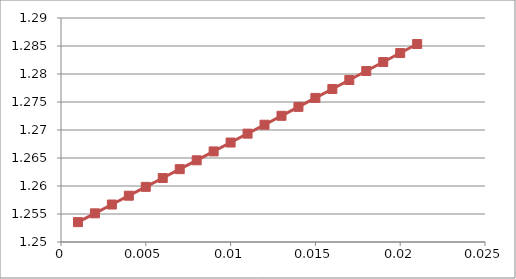
| Category | Series 1 |
|---|---|
| 0.001 | 1.254 |
| 0.002 | 1.255 |
| 0.003 | 1.257 |
| 0.004 | 1.258 |
| 0.005 | 1.26 |
| 0.006 | 1.261 |
| 0.007 | 1.263 |
| 0.008 | 1.265 |
| 0.009000000000000001 | 1.266 |
| 0.010000000000000002 | 1.268 |
| 0.011000000000000003 | 1.269 |
| 0.012000000000000004 | 1.271 |
| 0.013000000000000005 | 1.273 |
| 0.014000000000000005 | 1.274 |
| 0.015000000000000006 | 1.276 |
| 0.016000000000000007 | 1.277 |
| 0.017000000000000008 | 1.279 |
| 0.01800000000000001 | 1.281 |
| 0.01900000000000001 | 1.282 |
| 0.02000000000000001 | 1.284 |
| 0.02100000000000001 | 1.285 |